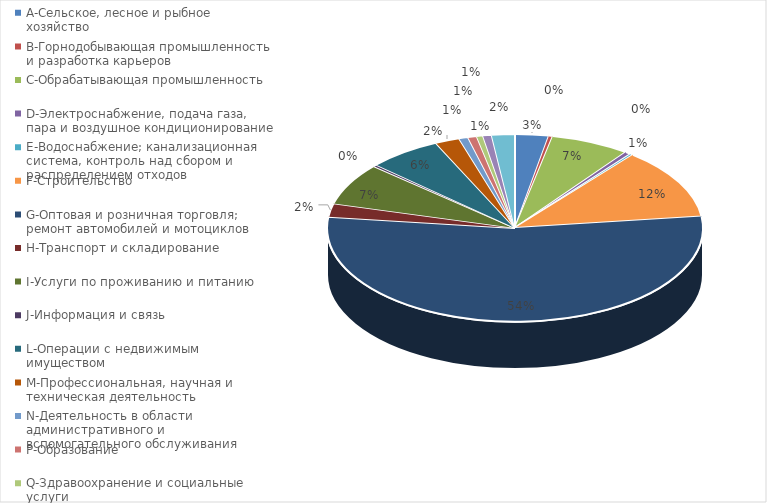
| Category | Series 0 |
|---|---|
| A-Сельское, лесное и рыбное хозяйство | 0.029 |
| B-Горнодобывающая промышленность и разработка карьеров | 0.003 |
| C-Обрабатывающая промышленность | 0.068 |
| D-Электроснабжение, подача газа, пара и воздушное кондиционирование | 0.005 |
| E-Водоснабжение; канализационная система, контроль над сбором и распределением отходов | 0.002 |
| F-Строительство | 0.123 |
| G-Оптовая и розничная торговля; ремонт автомобилей и мотоциклов | 0.538 |
| H-Транспорт и складирование | 0.023 |
| I-Услуги по проживанию и питанию | 0.072 |
| J-Информация и связь | 0.003 |
| L-Операции с недвижимым имуществом | 0.063 |
| M-Профессиональная, научная и техническая деятельность | 0.021 |
| N-Деятельность в области административного и вспомогательного обслуживания | 0.008 |
| P-Образование | 0.008 |
| Q-Здравоохранение и социальные услуги | 0.005 |
| R-Искусство, развлечения и отдых | 0.007 |
| S-Предоставление прочих видов услуг | 0.02 |